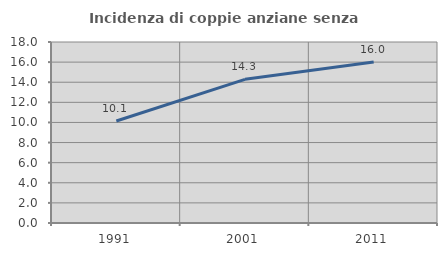
| Category | Incidenza di coppie anziane senza figli  |
|---|---|
| 1991.0 | 10.145 |
| 2001.0 | 14.286 |
| 2011.0 | 16 |